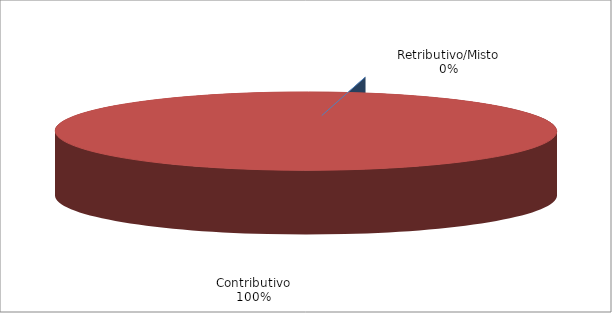
| Category | Series 1 |
|---|---|
| Retributivo/Misto | 0 |
| Contributivo | 25036 |